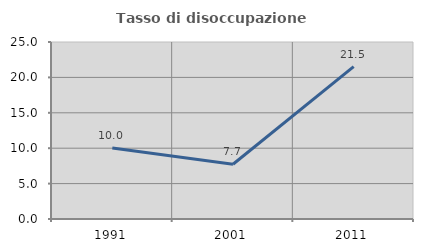
| Category | Tasso di disoccupazione giovanile  |
|---|---|
| 1991.0 | 10.036 |
| 2001.0 | 7.729 |
| 2011.0 | 21.512 |